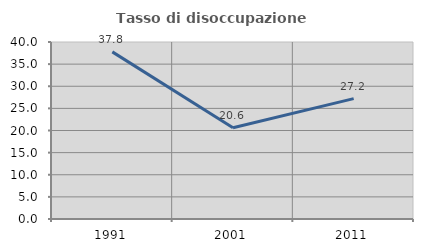
| Category | Tasso di disoccupazione giovanile  |
|---|---|
| 1991.0 | 37.769 |
| 2001.0 | 20.637 |
| 2011.0 | 27.195 |